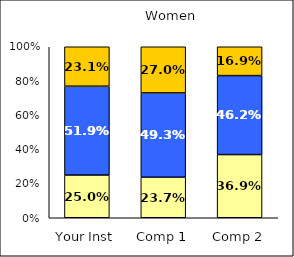
| Category | Low Institutional Priority: Civic Engagement | Average Institutional Priority: Civic Engagement | High Institutional Priority: Civic Engagement |
|---|---|---|---|
| Your Inst | 0.25 | 0.519 | 0.231 |
| Comp 1 | 0.237 | 0.493 | 0.27 |
| Comp 2 | 0.369 | 0.462 | 0.169 |